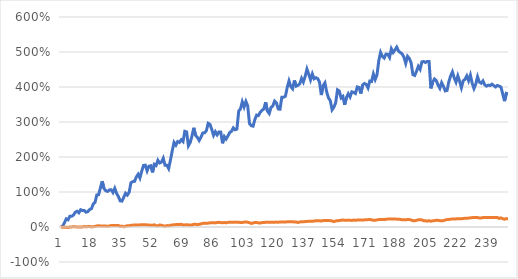
| Category | DAC % Change | S&P 500 % Change |
|---|---|---|
| 0 | 0.008 | 0.003 |
| 1 | 0.027 | -0.005 |
| 2 | 0.126 | -0.006 |
| 3 | 0.232 | -0.008 |
| 4 | 0.206 | -0.012 |
| 5 | 0.308 | 0.001 |
| 6 | 0.307 | 0.002 |
| 7 | 0.341 | 0.008 |
| 8 | 0.421 | 0.005 |
| 9 | 0.451 | 0.001 |
| 10 | 0.406 | -0.001 |
| 11 | 0.494 | -0.001 |
| 12 | 0.47 | 0.003 |
| 13 | 0.472 | 0.012 |
| 14 | 0.423 | 0.01 |
| 15 | 0.44 | 0.011 |
| 16 | 0.5 | 0.017 |
| 17 | 0.523 | 0.002 |
| 18 | 0.655 | 0.009 |
| 19 | 0.703 | 0.015 |
| 20 | 0.915 | 0.03 |
| 21 | 0.923 | 0.036 |
| 22 | 1.119 | 0.029 |
| 23 | 1.308 | 0.03 |
| 24 | 1.098 | 0.032 |
| 25 | 1.036 | 0.028 |
| 26 | 1.017 | 0.021 |
| 27 | 1.059 | 0.029 |
| 28 | 1.065 | 0.043 |
| 29 | 0.985 | 0.044 |
| 30 | 1.105 | 0.04 |
| 31 | 0.962 | 0.044 |
| 32 | 0.871 | 0.043 |
| 33 | 0.747 | 0.016 |
| 34 | 0.74 | 0.026 |
| 35 | 0.85 | 0.006 |
| 36 | 0.966 | 0.022 |
| 37 | 0.915 | 0.036 |
| 38 | 0.993 | 0.037 |
| 39 | 1.265 | 0.049 |
| 40 | 1.297 | 0.053 |
| 41 | 1.304 | 0.061 |
| 42 | 1.43 | 0.059 |
| 43 | 1.508 | 0.059 |
| 44 | 1.4 | 0.061 |
| 45 | 1.594 | 0.066 |
| 46 | 1.759 | 0.065 |
| 47 | 1.766 | 0.065 |
| 48 | 1.605 | 0.06 |
| 49 | 1.737 | 0.058 |
| 50 | 1.75 | 0.05 |
| 51 | 1.561 | 0.051 |
| 52 | 1.791 | 0.063 |
| 53 | 1.757 | 0.037 |
| 54 | 1.907 | 0.032 |
| 55 | 1.83 | 0.057 |
| 56 | 1.855 | 0.048 |
| 57 | 1.964 | 0.035 |
| 58 | 1.764 | 0.021 |
| 59 | 1.762 | 0.041 |
| 60 | 1.669 | 0.035 |
| 61 | 1.914 | 0.05 |
| 62 | 2.177 | 0.056 |
| 63 | 2.418 | 0.067 |
| 64 | 2.34 | 0.068 |
| 65 | 2.443 | 0.075 |
| 66 | 2.416 | 0.073 |
| 67 | 2.491 | 0.076 |
| 68 | 2.442 | 0.061 |
| 69 | 2.733 | 0.06 |
| 70 | 2.717 | 0.067 |
| 71 | 2.322 | 0.059 |
| 72 | 2.412 | 0.053 |
| 73 | 2.603 | 0.059 |
| 74 | 2.834 | 0.077 |
| 75 | 2.618 | 0.076 |
| 76 | 2.561 | 0.072 |
| 77 | 2.472 | 0.076 |
| 78 | 2.567 | 0.089 |
| 79 | 2.687 | 0.105 |
| 80 | 2.691 | 0.103 |
| 81 | 2.75 | 0.105 |
| 82 | 2.963 | 0.11 |
| 83 | 2.933 | 0.118 |
| 84 | 2.787 | 0.118 |
| 85 | 2.619 | 0.122 |
| 86 | 2.722 | 0.117 |
| 87 | 2.633 | 0.13 |
| 88 | 2.717 | 0.134 |
| 89 | 2.712 | 0.128 |
| 90 | 2.392 | 0.12 |
| 91 | 2.583 | 0.13 |
| 92 | 2.513 | 0.12 |
| 93 | 2.602 | 0.132 |
| 94 | 2.699 | 0.134 |
| 95 | 2.736 | 0.134 |
| 96 | 2.831 | 0.133 |
| 97 | 2.777 | 0.141 |
| 98 | 2.799 | 0.133 |
| 99 | 3.312 | 0.136 |
| 100 | 3.378 | 0.128 |
| 101 | 3.577 | 0.129 |
| 102 | 3.43 | 0.138 |
| 103 | 3.588 | 0.146 |
| 104 | 3.461 | 0.134 |
| 105 | 2.955 | 0.125 |
| 106 | 2.894 | 0.101 |
| 107 | 2.882 | 0.114 |
| 108 | 3.071 | 0.131 |
| 109 | 3.198 | 0.128 |
| 110 | 3.184 | 0.118 |
| 111 | 3.28 | 0.115 |
| 112 | 3.334 | 0.127 |
| 113 | 3.373 | 0.126 |
| 114 | 3.567 | 0.137 |
| 115 | 3.309 | 0.134 |
| 116 | 3.243 | 0.137 |
| 117 | 3.418 | 0.138 |
| 118 | 3.46 | 0.139 |
| 119 | 3.598 | 0.138 |
| 120 | 3.547 | 0.14 |
| 121 | 3.374 | 0.136 |
| 122 | 3.365 | 0.146 |
| 123 | 3.707 | 0.145 |
| 124 | 3.708 | 0.145 |
| 125 | 3.734 | 0.143 |
| 126 | 3.984 | 0.148 |
| 127 | 4.174 | 0.15 |
| 128 | 4.013 | 0.153 |
| 129 | 3.95 | 0.15 |
| 130 | 4.186 | 0.144 |
| 131 | 4.025 | 0.144 |
| 132 | 4.048 | 0.129 |
| 133 | 4.093 | 0.144 |
| 134 | 4.247 | 0.15 |
| 135 | 4.143 | 0.149 |
| 136 | 4.304 | 0.156 |
| 137 | 4.511 | 0.159 |
| 138 | 4.364 | 0.162 |
| 139 | 4.204 | 0.162 |
| 140 | 4.374 | 0.164 |
| 141 | 4.234 | 0.17 |
| 142 | 4.266 | 0.179 |
| 143 | 4.239 | 0.176 |
| 144 | 4.136 | 0.18 |
| 145 | 3.77 | 0.17 |
| 146 | 4.042 | 0.184 |
| 147 | 4.12 | 0.188 |
| 148 | 3.857 | 0.183 |
| 149 | 3.688 | 0.185 |
| 150 | 3.608 | 0.181 |
| 151 | 3.348 | 0.172 |
| 152 | 3.423 | 0.153 |
| 153 | 3.548 | 0.171 |
| 154 | 3.92 | 0.181 |
| 155 | 3.887 | 0.183 |
| 156 | 3.687 | 0.195 |
| 157 | 3.731 | 0.198 |
| 158 | 3.493 | 0.192 |
| 159 | 3.7 | 0.192 |
| 160 | 3.807 | 0.197 |
| 161 | 3.716 | 0.19 |
| 162 | 3.863 | 0.188 |
| 163 | 3.845 | 0.198 |
| 164 | 3.814 | 0.192 |
| 165 | 4.002 | 0.2 |
| 166 | 3.986 | 0.202 |
| 167 | 3.812 | 0.201 |
| 168 | 4.058 | 0.202 |
| 169 | 4.101 | 0.203 |
| 170 | 4.076 | 0.208 |
| 171 | 3.973 | 0.21 |
| 172 | 4.17 | 0.213 |
| 173 | 4.157 | 0.205 |
| 174 | 4.372 | 0.192 |
| 175 | 4.216 | 0.193 |
| 176 | 4.347 | 0.203 |
| 177 | 4.756 | 0.213 |
| 178 | 4.988 | 0.215 |
| 179 | 4.873 | 0.218 |
| 180 | 4.826 | 0.211 |
| 181 | 4.941 | 0.221 |
| 182 | 4.935 | 0.227 |
| 183 | 4.845 | 0.225 |
| 184 | 5.091 | 0.225 |
| 185 | 4.985 | 0.229 |
| 186 | 5.059 | 0.228 |
| 187 | 5.139 | 0.224 |
| 188 | 5.028 | 0.223 |
| 189 | 4.983 | 0.217 |
| 190 | 4.947 | 0.208 |
| 191 | 4.852 | 0.21 |
| 192 | 4.675 | 0.203 |
| 193 | 4.878 | 0.214 |
| 194 | 4.818 | 0.212 |
| 195 | 4.689 | 0.201 |
| 196 | 4.353 | 0.18 |
| 197 | 4.33 | 0.179 |
| 198 | 4.449 | 0.191 |
| 199 | 4.59 | 0.205 |
| 200 | 4.505 | 0.207 |
| 201 | 4.718 | 0.203 |
| 202 | 4.728 | 0.179 |
| 203 | 4.7 | 0.181 |
| 204 | 4.731 | 0.167 |
| 205 | 4.73 | 0.18 |
| 206 | 3.961 | 0.165 |
| 207 | 4.141 | 0.177 |
| 208 | 4.23 | 0.182 |
| 209 | 4.185 | 0.192 |
| 210 | 4.055 | 0.189 |
| 211 | 3.963 | 0.181 |
| 212 | 4.126 | 0.178 |
| 213 | 4.022 | 0.182 |
| 214 | 3.889 | 0.202 |
| 215 | 3.902 | 0.211 |
| 216 | 4.15 | 0.215 |
| 217 | 4.316 | 0.224 |
| 218 | 4.432 | 0.229 |
| 219 | 4.26 | 0.232 |
| 220 | 4.138 | 0.231 |
| 221 | 4.318 | 0.237 |
| 222 | 4.162 | 0.239 |
| 223 | 3.98 | 0.233 |
| 224 | 4.176 | 0.245 |
| 225 | 4.22 | 0.247 |
| 226 | 4.317 | 0.25 |
| 227 | 4.181 | 0.254 |
| 228 | 4.341 | 0.262 |
| 229 | 4.105 | 0.268 |
| 230 | 3.957 | 0.272 |
| 231 | 4.083 | 0.273 |
| 232 | 4.295 | 0.269 |
| 233 | 4.141 | 0.259 |
| 234 | 4.107 | 0.259 |
| 235 | 4.174 | 0.268 |
| 236 | 4.062 | 0.268 |
| 237 | 4.025 | 0.273 |
| 238 | 4.053 | 0.27 |
| 239 | 4.041 | 0.274 |
| 240 | 4.082 | 0.272 |
| 241 | 4.042 | 0.268 |
| 242 | 4.001 | 0.271 |
| 243 | 4.045 | 0.273 |
| 244 | 4.024 | 0.244 |
| 245 | 3.999 | 0.261 |
| 246 | 3.807 | 0.237 |
| 247 | 3.597 | 0.222 |
| 248 | 3.819 | 0.24 |
| 249 | 3.8 | 0.229 |